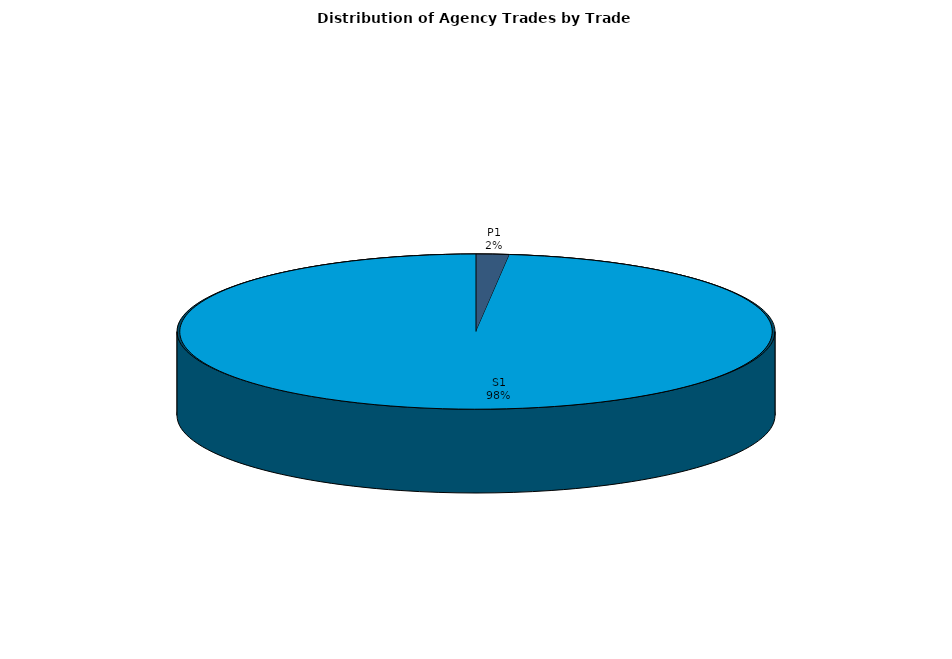
| Category | Series 0 |
|---|---|
| P1 | 47.726 |
| S1 | 2618.956 |